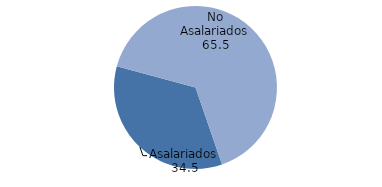
| Category | Series 0 |
|---|---|
| Asalariados | 34.451 |
| No Asalariados | 65.549 |